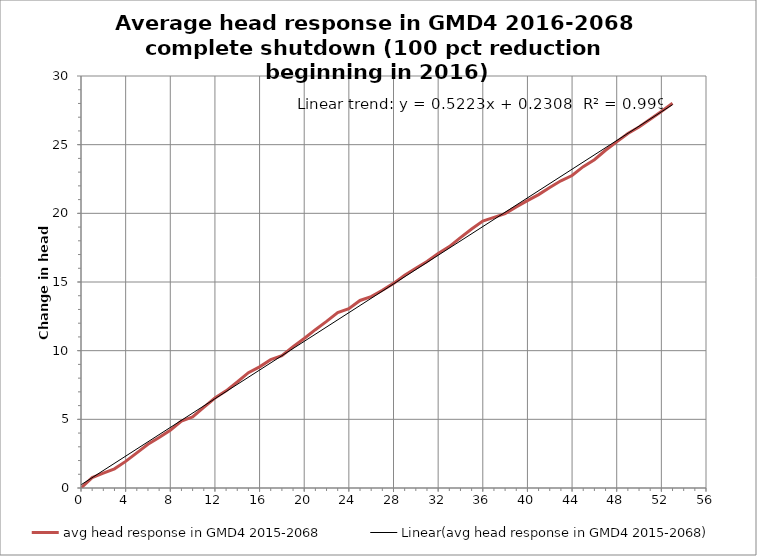
| Category | avg head response in GMD4 2015-2068 |
|---|---|
| 0.0 | 0 |
| 1.0 | 0.756 |
| 2.0 | 1.082 |
| 3.0 | 1.397 |
| 4.0 | 1.937 |
| 5.0 | 2.559 |
| 6.0 | 3.185 |
| 7.0 | 3.675 |
| 8.0 | 4.206 |
| 9.0 | 4.869 |
| 10.0 | 5.181 |
| 11.0 | 5.867 |
| 12.0 | 6.55 |
| 13.0 | 7.072 |
| 14.0 | 7.721 |
| 15.0 | 8.4 |
| 16.0 | 8.823 |
| 17.0 | 9.343 |
| 18.0 | 9.632 |
| 19.0 | 10.281 |
| 20.0 | 10.884 |
| 21.0 | 11.528 |
| 22.0 | 12.132 |
| 23.0 | 12.774 |
| 24.0 | 13.053 |
| 25.0 | 13.656 |
| 26.0 | 13.934 |
| 27.0 | 14.396 |
| 28.0 | 14.899 |
| 29.0 | 15.492 |
| 30.0 | 15.996 |
| 31.0 | 16.496 |
| 32.0 | 17.079 |
| 33.0 | 17.576 |
| 34.0 | 18.232 |
| 35.0 | 18.863 |
| 36.0 | 19.439 |
| 37.0 | 19.704 |
| 38.0 | 19.978 |
| 39.0 | 20.467 |
| 40.0 | 20.922 |
| 41.0 | 21.365 |
| 42.0 | 21.879 |
| 43.0 | 22.367 |
| 44.0 | 22.756 |
| 45.0 | 23.398 |
| 46.0 | 23.905 |
| 47.0 | 24.593 |
| 48.0 | 25.205 |
| 49.0 | 25.81 |
| 50.0 | 26.281 |
| 51.0 | 26.848 |
| 52.0 | 27.418 |
| 53.0 | 28.02 |